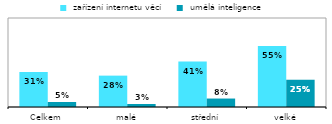
| Category |  zařízení internetu věcí |  umělá inteligence |
|---|---|---|
| Celkem | 0.314 | 0.045 |
| malé | 0.282 | 0.027 |
| střední | 0.408 | 0.076 |
| velké | 0.549 | 0.245 |